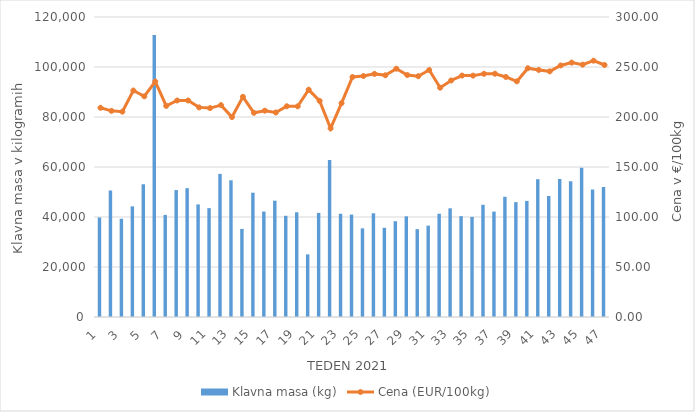
| Category | Klavna masa (kg) |
|---|---|
| 1.0 | 39814 |
| 2.0 | 50603 |
| 3.0 | 39295 |
| 4.0 | 44250 |
| 5.0 | 53061 |
| 6.0 | 112816 |
| 7.0 | 40829 |
| 8.0 | 50775 |
| 9.0 | 51535 |
| 10.0 | 45040 |
| 11.0 | 43536 |
| 12.0 | 57246 |
| 13.0 | 54680 |
| 14.0 | 35237 |
| 15.0 | 49721 |
| 16.0 | 42177 |
| 17.0 | 46525 |
| 18.0 | 40491 |
| 19.0 | 41888 |
| 20.0 | 25048 |
| 21.0 | 41651 |
| 22.0 | 62774 |
| 23.0 | 41297 |
| 24.0 | 40971 |
| 25.0 | 35465 |
| 26.0 | 41489 |
| 27.0 | 35675 |
| 28.0 | 38316 |
| 29.0 | 40265 |
| 30.0 | 35146 |
| 31.0 | 36548 |
| 32.0 | 41314 |
| 33.0 | 43471 |
| 34.0 | 40333 |
| 35.0 | 40041 |
| 36.0 | 44895 |
| 37.0 | 42158 |
| 38.0 | 48077 |
| 39.0 | 45950 |
| 40.0 | 46433 |
| 41.0 | 55121 |
| 42.0 | 48414 |
| 43.0 | 55179 |
| 44.0 | 54294 |
| 45.0 | 59707 |
| 46.0 | 51007 |
| 47.0 | 52010 |